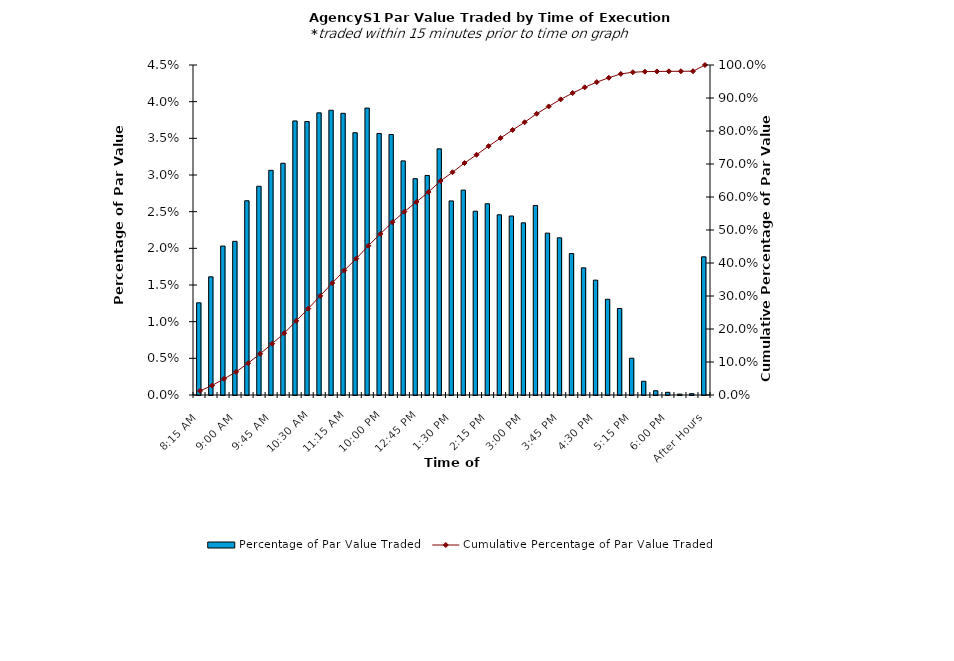
| Category | Percentage of Par Value Traded |
|---|---|
| 8:15 AM | 0.013 |
| 8:30 AM | 0.016 |
| 8:45 AM | 0.02 |
| 9:00 AM | 0.021 |
| 9:15 AM | 0.026 |
| 9:30 AM | 0.028 |
| 9:45 AM | 0.031 |
| 10:00 AM | 0.032 |
| 10:15 AM | 0.037 |
| 10:30 AM | 0.037 |
| 10:45 AM | 0.038 |
| 11:00 AM | 0.039 |
| 11:15 AM | 0.038 |
| 11:30 AM | 0.036 |
| 11:45 AM | 0.039 |
| 12:00 PM | 0.036 |
| 12:15 PM | 0.036 |
| 12:30 PM | 0.032 |
| 12:45 PM | 0.029 |
| 1:00 PM | 0.03 |
| 1:15 PM | 0.034 |
| 1:30 PM | 0.026 |
| 1:45 PM | 0.028 |
| 2:00 PM | 0.025 |
| 2:15 PM | 0.026 |
| 2:30 PM | 0.025 |
| 2:45 PM | 0.024 |
| 3:00 PM | 0.023 |
| 3:15 PM | 0.026 |
| 3:30 PM | 0.022 |
| 3:45 PM | 0.021 |
| 4:00 PM | 0.019 |
| 4:15 PM | 0.017 |
| 4:30 PM | 0.016 |
| 4:45 PM | 0.013 |
| 5:00 PM | 0.012 |
| 5:15 PM | 0.005 |
| 5:30 PM | 0.002 |
| 5:45 PM | 0.001 |
| 6:00 PM | 0 |
| 6:15 PM | 0 |
| 6:30 PM | 0 |
| After Hours | 0.019 |